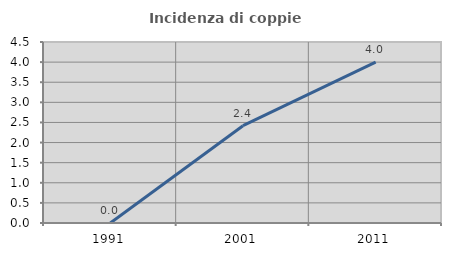
| Category | Incidenza di coppie miste |
|---|---|
| 1991.0 | 0 |
| 2001.0 | 2.419 |
| 2011.0 | 4 |